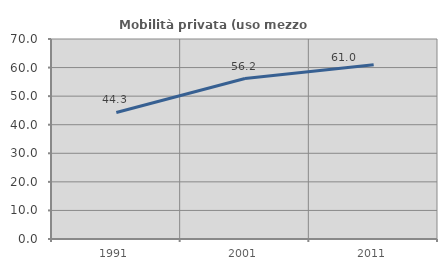
| Category | Mobilità privata (uso mezzo privato) |
|---|---|
| 1991.0 | 44.284 |
| 2001.0 | 56.17 |
| 2011.0 | 60.955 |